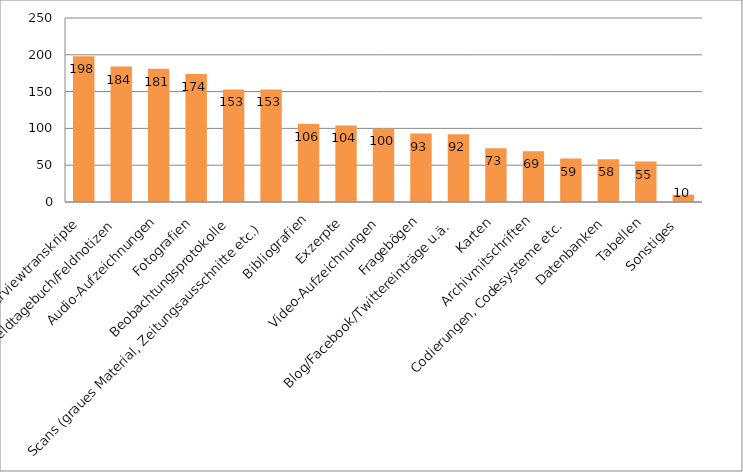
| Category | Series 0 |
|---|---|
| Interviewtranskripte | 198 |
| Feldtagebuch/Feldnotizen | 184 |
| Audio-Aufzeichnungen | 181 |
| Fotografien | 174 |
| Beobachtungsprotokolle | 153 |
| Scans (graues Material, Zeitungsausschnitte etc.) | 153 |
| Bibliografien | 106 |
| Exzerpte | 104 |
| Video-Aufzeichnungen | 100 |
| Fragebögen | 93 |
| Blog/Facebook/Twittereinträge u.ä. | 92 |
| Karten | 73 |
| Archivmitschriften | 69 |
| Codierungen, Codesysteme etc. | 59 |
| Datenbanken | 58 |
| Tabellen | 55 |
| Sonstiges  | 10 |